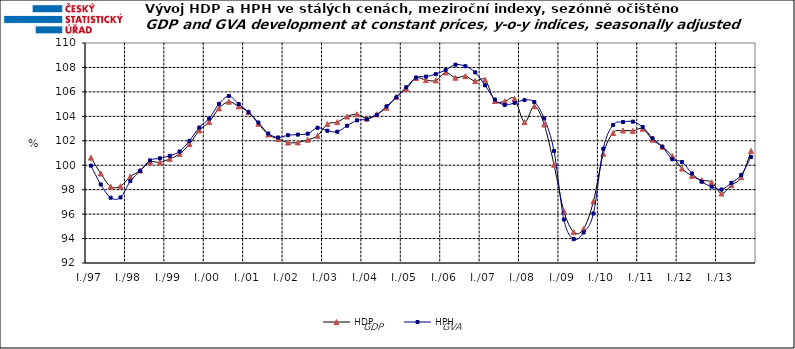
| Category | HDP

 | HPH

 |
|---|---|---|
| I./97 | 100.621 | 99.964 |
|  | 99.325 | 98.423 |
|  | 98.252 | 97.342 |
|  | 98.282 | 97.362 |
| I./98 | 99.065 | 98.701 |
|  | 99.568 | 99.541 |
|  | 100.267 | 100.397 |
|  | 100.231 | 100.564 |
| I./99 | 100.524 | 100.773 |
|  | 100.931 | 101.125 |
|  | 101.729 | 101.996 |
|  | 102.849 | 103.086 |
| I./00 | 103.535 | 103.82 |
|  | 104.65 | 105.018 |
|  | 105.196 | 105.657 |
|  | 104.81 | 105.006 |
| I./01 | 104.338 | 104.343 |
|  | 103.388 | 103.495 |
|  | 102.511 | 102.593 |
|  | 102.147 | 102.273 |
| I./02 | 101.854 | 102.455 |
|  | 101.867 | 102.504 |
|  | 102.082 | 102.581 |
|  | 102.411 | 103.067 |
| I./03 | 103.37 | 102.823 |
|  | 103.523 | 102.743 |
|  | 103.981 | 103.229 |
|  | 104.169 | 103.671 |
| I./04 | 103.825 | 103.759 |
|  | 104.165 | 104.118 |
|  | 104.711 | 104.819 |
|  | 105.601 | 105.551 |
| I./05 | 106.254 | 106.379 |
|  | 107.136 | 107.171 |
|  | 106.966 | 107.25 |
|  | 106.937 | 107.453 |
| I./06 | 107.587 | 107.788 |
|  | 107.161 | 108.228 |
|  | 107.287 | 108.1 |
|  | 106.879 | 107.595 |
| I./07 | 106.998 | 106.541 |
|  | 105.254 | 105.373 |
|  | 105.235 | 104.937 |
|  | 105.436 | 105.101 |
| I./08 | 103.521 | 105.327 |
|  | 104.833 | 105.17 |
|  | 103.333 | 103.834 |
|  | 100.038 | 101.168 |
| I./09 | 96.252 | 95.555 |
|  | 94.53 | 93.953 |
|  | 94.783 | 94.499 |
|  | 97.038 | 96.049 |
| I./10 | 100.937 | 101.35 |
|  | 102.638 | 103.295 |
|  | 102.842 | 103.537 |
|  | 102.815 | 103.566 |
| I./11 | 102.985 | 103.123 |
|  | 102.084 | 102.205 |
|  | 101.513 | 101.513 |
|  | 100.754 | 100.493 |
| I./12 | 99.727 | 100.263 |
|  | 99.129 | 99.325 |
|  | 98.778 | 98.647 |
|  | 98.611 | 98.242 |
| I./13 | 97.687 | 98.013 |